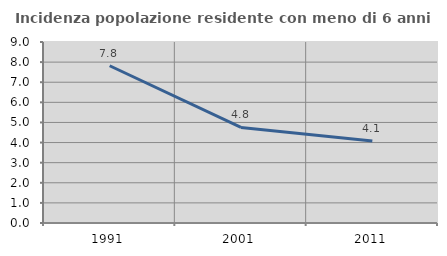
| Category | Incidenza popolazione residente con meno di 6 anni |
|---|---|
| 1991.0 | 7.82 |
| 2001.0 | 4.752 |
| 2011.0 | 4.079 |